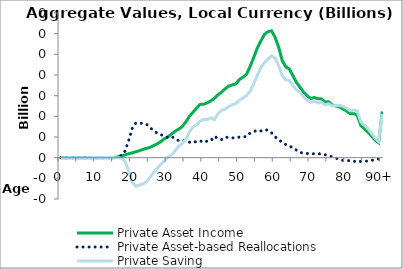
| Category | Private Asset Income | Private Asset-based Reallocations | Private Saving |
|---|---|---|---|
| 0 | 0 | -0.003 | 0.003 |
|  | 0 | -0.003 | 0.003 |
| 2 | 0 | -0.003 | 0.003 |
| 3 | 0 | -0.003 | 0.003 |
| 4 | 0 | -0.003 | 0.003 |
| 5 | 0 | -0.003 | 0.003 |
| 6 | 0 | -0.003 | 0.003 |
| 7 | 0 | -0.003 | 0.003 |
| 8 | 0 | -0.004 | 0.004 |
| 9 | 0 | -0.004 | 0.004 |
| 10 | 0 | -0.004 | 0.004 |
| 11 | 0 | -0.005 | 0.005 |
| 12 | 0 | -0.005 | 0.005 |
| 13 | 0 | -0.005 | 0.005 |
| 14 | 0 | -0.005 | 0.005 |
| 15 | 0 | -0.006 | 0.006 |
| 16 | 0.086 | 0.098 | -0.013 |
| 17 | 0.173 | 0.217 | -0.044 |
| 18 | 0.28 | 0.643 | -0.363 |
| 19 | 0.375 | 1.656 | -1.281 |
| 20 | 0.47 | 2.83 | -2.36 |
| 21 | 0.572 | 3.354 | -2.782 |
| 22 | 0.67 | 3.315 | -2.645 |
| 23 | 0.798 | 3.34 | -2.542 |
| 24 | 0.901 | 3.238 | -2.337 |
| 25 | 1.002 | 2.911 | -1.909 |
| 26 | 1.162 | 2.605 | -1.443 |
| 27 | 1.337 | 2.376 | -1.039 |
| 28 | 1.563 | 2.212 | -0.649 |
| 29 | 1.824 | 2.134 | -0.31 |
| 30 | 2.012 | 1.935 | 0.077 |
| 31 | 2.281 | 2.014 | 0.267 |
| 32 | 2.563 | 1.899 | 0.663 |
| 33 | 2.756 | 1.643 | 1.114 |
| 34 | 3.008 | 1.643 | 1.366 |
| 35 | 3.455 | 1.677 | 1.779 |
| 36 | 3.991 | 1.503 | 2.488 |
| 37 | 4.398 | 1.434 | 2.964 |
| 38 | 4.774 | 1.589 | 3.186 |
| 39 | 5.156 | 1.636 | 3.52 |
| 40 | 5.166 | 1.469 | 3.697 |
| 41 | 5.302 | 1.613 | 3.689 |
| 42 | 5.492 | 1.638 | 3.854 |
| 43 | 5.743 | 2.07 | 3.673 |
| 44 | 6.089 | 1.849 | 4.24 |
| 45 | 6.331 | 1.756 | 4.575 |
| 46 | 6.656 | 1.981 | 4.675 |
| 47 | 6.913 | 1.958 | 4.955 |
| 48 | 7.045 | 1.918 | 5.128 |
| 49 | 7.137 | 1.897 | 5.24 |
| 50 | 7.56 | 1.995 | 5.565 |
| 51 | 7.791 | 2.028 | 5.763 |
| 52 | 8.057 | 2.04 | 6.017 |
| 53 | 8.822 | 2.386 | 6.436 |
| 54 | 9.676 | 2.524 | 7.151 |
| 55 | 10.603 | 2.638 | 7.965 |
| 56 | 11.283 | 2.58 | 8.703 |
| 57 | 11.918 | 2.724 | 9.194 |
| 58 | 12.193 | 2.661 | 9.532 |
| 59 | 12.277 | 2.41 | 9.867 |
| 60 | 11.651 | 2.011 | 9.64 |
| 61 | 10.697 | 1.788 | 8.909 |
| 62 | 9.401 | 1.446 | 7.955 |
| 63 | 8.786 | 1.263 | 7.523 |
| 64 | 8.584 | 1.108 | 7.475 |
| 65 | 7.931 | 0.969 | 6.962 |
| 66 | 7.269 | 0.723 | 6.546 |
| 67 | 6.812 | 0.503 | 6.309 |
| 68 | 6.312 | 0.455 | 5.857 |
| 69 | 5.979 | 0.407 | 5.572 |
| 70 | 5.725 | 0.36 | 5.366 |
| 71 | 5.825 | 0.386 | 5.44 |
| 72 | 5.695 | 0.395 | 5.301 |
| 73 | 5.689 | 0.334 | 5.355 |
| 74 | 5.387 | 0.284 | 5.104 |
| 75 | 5.41 | 0.202 | 5.208 |
| 76 | 5.096 | 0.079 | 5.017 |
| 77 | 5.006 | -0.047 | 5.054 |
| 78 | 4.92 | -0.156 | 5.076 |
| 79 | 4.704 | -0.265 | 4.969 |
| 80 | 4.531 | -0.274 | 4.805 |
| 81 | 4.25 | -0.292 | 4.542 |
| 82 | 4.26 | -0.342 | 4.602 |
| 83 | 4.129 | -0.41 | 4.54 |
| 84 | 3.116 | -0.357 | 3.473 |
| 85 | 2.786 | -0.354 | 3.14 |
| 86 | 2.481 | -0.323 | 2.803 |
| 87 | 2.094 | -0.265 | 2.359 |
| 88 | 1.71 | -0.186 | 1.896 |
| 89 | 1.445 | -0.12 | 1.565 |
| 90+ | 4.471 | 0.239 | 4.232 |